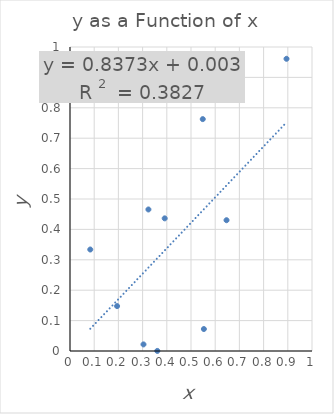
| Category | y |
|---|---|
| 0.19459555297629438 | 0.148 |
| 0.8947178093526891 | 0.961 |
| 0.3240460385444769 | 0.466 |
| 0.6468208705280143 | 0.43 |
| 0.5486052492204301 | 0.763 |
| 0.36074565653940416 | 0 |
| 0.08375095006699662 | 0.334 |
| 0.3913329115144173 | 0.436 |
| 0.3036584917046453 | 0.022 |
| 0.5531815208171534 | 0.072 |